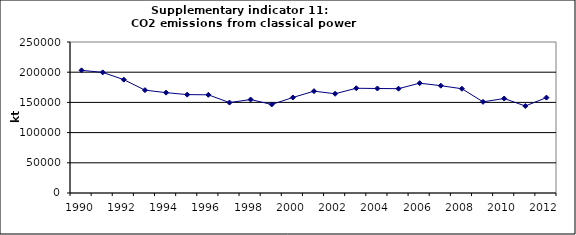
| Category | CO2 emissions from classical power production, kt |
|---|---|
| 1990 | 203096.274 |
| 1991 | 199711.115 |
| 1992 | 187675.945 |
| 1993 | 170303.531 |
| 1994 | 166147.273 |
| 1995 | 162910.562 |
| 1996 | 162561.482 |
| 1997 | 149729.46 |
| 1998 | 154727.539 |
| 1999 | 146577.125 |
| 2000 | 158154.49 |
| 2001 | 168602.834 |
| 2002 | 164339.645 |
| 2003 | 173423.589 |
| 2004 | 173034.578 |
| 2005 | 172714.393 |
| 2006 | 181835.445 |
| 2007 | 177645.037 |
| 2008 | 172623.599 |
| 2009 | 150948.709 |
| 2010 | 156429.131 |
| 2011 | 144018.183 |
| 2012 | 157917.841 |